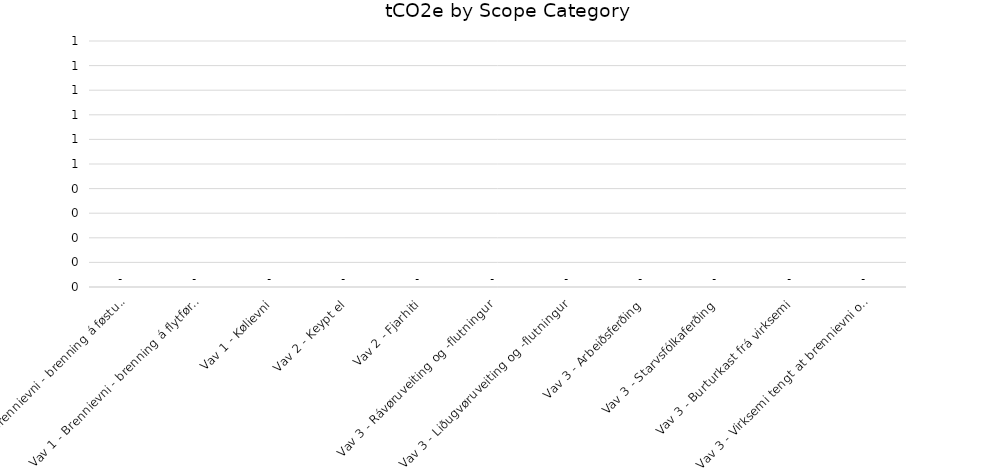
| Category | Series 0 |
|---|---|
| Vav 1 - Brennievni - brenning á føstum skipanum | 0 |
| Vav 1 - Brennievni - brenning á flytførum skipanum | 0 |
| Vav 1 - Kølievni | 0 |
| Vav 2 - Keypt el | 0 |
| Vav 2 - Fjarhiti | 0 |
| Vav 3 - Rávøruveiting og -flutningur | 0 |
| Vav 3 - Liðugvøruveiting og -flutningur | 0 |
| Vav 3 - Arbeiðsferðing | 0 |
| Vav 3 - Starvsfólkaferðing | 0 |
| Vav 3 - Burturkast frá virksemi | 0 |
| Vav 3 - Virksemi tengt at brennievni og orku | 0 |